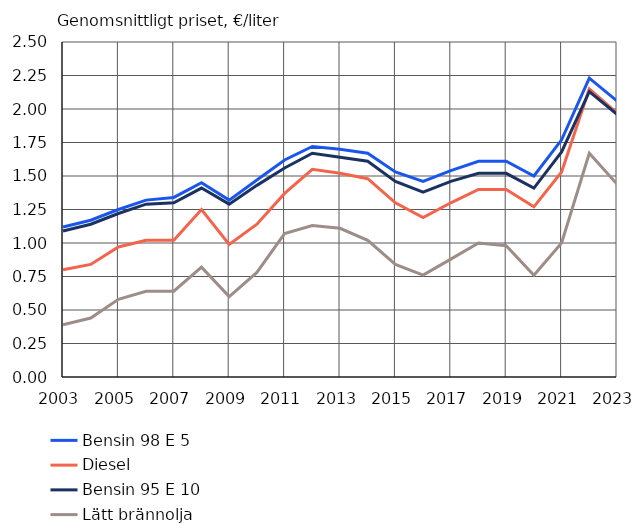
| Category | Bensin 98 E 5 | Diesel | Bensin 95 E 10 | Lätt brännolja |
|---|---|---|---|---|
| 2003.0 | 1.12 | 0.8 | 1.09 | 0.39 |
| 2004.0 | 1.17 | 0.84 | 1.14 | 0.44 |
| 2005.0 | 1.25 | 0.97 | 1.22 | 0.58 |
| 2006.0 | 1.32 | 1.02 | 1.29 | 0.64 |
| 2007.0 | 1.34 | 1.02 | 1.3 | 0.64 |
| 2008.0 | 1.45 | 1.25 | 1.41 | 0.82 |
| 2009.0 | 1.32 | 0.99 | 1.29 | 0.6 |
| 2010.0 | 1.47 | 1.14 | 1.43 | 0.78 |
| 2011.0 | 1.62 | 1.37 | 1.56 | 1.07 |
| 2012.0 | 1.72 | 1.55 | 1.67 | 1.13 |
| 2013.0 | 1.7 | 1.52 | 1.64 | 1.11 |
| 2014.0 | 1.67 | 1.48 | 1.61 | 1.02 |
| 2015.0 | 1.53 | 1.3 | 1.46 | 0.84 |
| 2016.0 | 1.46 | 1.19 | 1.38 | 0.76 |
| 2017.0 | 1.54 | 1.3 | 1.46 | 0.88 |
| 2018.0 | 1.61 | 1.4 | 1.52 | 1 |
| 2019.0 | 1.61 | 1.4 | 1.52 | 0.98 |
| 2020.0 | 1.5 | 1.27 | 1.41 | 0.76 |
| 2021.0 | 1.77 | 1.53 | 1.68 | 1 |
| 2022.0 | 2.23 | 2.15 | 2.13 | 1.67 |
| 2023.0 | 2.06 | 1.97 | 1.96 | 1.44 |